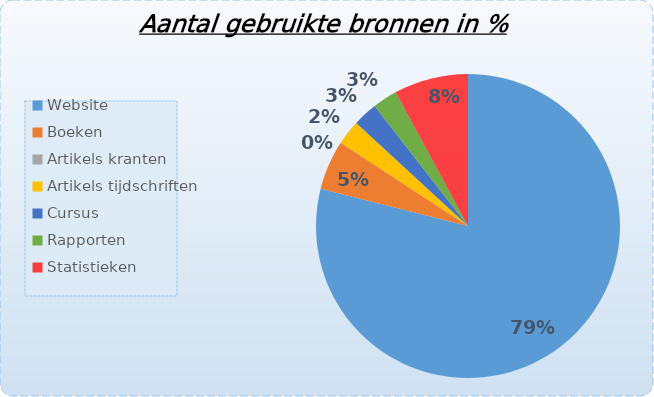
| Category | % |
|---|---|
| Website | 0.789 |
| Boeken | 0.053 |
| Artikels kranten | 0 |
| Artikels tijdschriften | 0.026 |
| Cursus  | 0.026 |
| Rapporten | 0.026 |
| Statistieken | 0.079 |